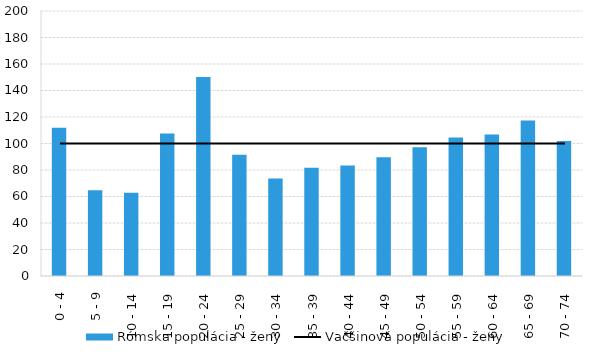
| Category | Rómska populácia - ženy |
|---|---|
| 0 - 4 | 111.854 |
| 5 - 9 | 64.709 |
| 10 - 14 | 62.854 |
| 15 - 19 | 107.64 |
| 20 - 24 | 150.275 |
| 25 - 29 | 91.505 |
| 30 - 34 | 73.524 |
| 35 - 39 | 81.76 |
| 40 - 44 | 83.488 |
| 45 - 49 | 89.688 |
| 50 - 54 | 97.079 |
| 55 - 59 | 104.481 |
| 60 - 64 | 106.715 |
| 65 - 69 | 117.394 |
| 70 - 74 | 101.847 |